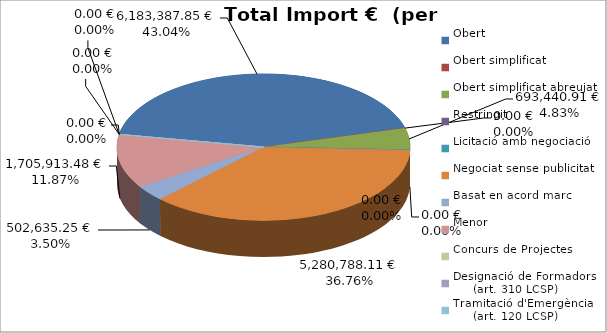
| Category | Total preu
(amb IVA) |
|---|---|
| Obert | 6183387.85 |
| Obert simplificat | 0 |
| Obert simplificat abreujat | 693440.91 |
| Restringit | 0 |
| Licitació amb negociació | 0 |
| Negociat sense publicitat | 5280788.11 |
| Basat en acord marc | 502635.25 |
| Menor | 1705913.48 |
| Concurs de Projectes | 0 |
| Designació de Formadors
     (art. 310 LCSP) | 0 |
| Tramitació d'Emergència
     (art. 120 LCSP) | 0 |